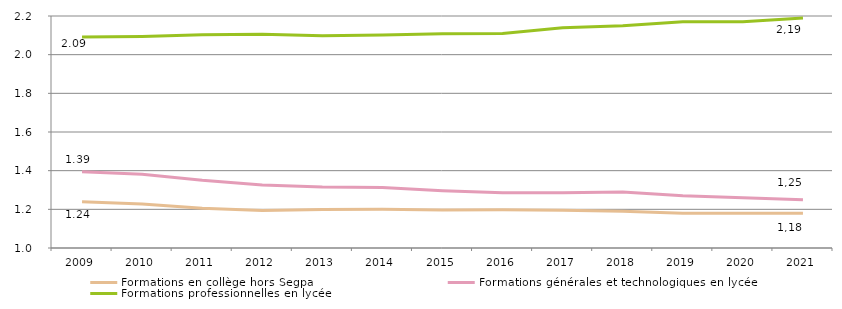
| Category | Formations en collège hors Segpa | Formations générales et technologiques en lycée | Formations professionnelles en lycée |
|---|---|---|---|
| 2009.0 | 1.239 | 1.394 | 2.091 |
| 2010.0 | 1.228 | 1.382 | 2.094 |
| 2011.0 | 1.206 | 1.35 | 2.103 |
| 2012.0 | 1.194 | 1.326 | 2.105 |
| 2013.0 | 1.199 | 1.316 | 2.097 |
| 2014.0 | 1.2 | 1.313 | 2.102 |
| 2015.0 | 1.196 | 1.297 | 2.108 |
| 2016.0 | 1.198 | 1.286 | 2.11 |
| 2017.0 | 1.195 | 1.285 | 2.139 |
| 2018.0 | 1.19 | 1.29 | 2.15 |
| 2019.0 | 1.18 | 1.27 | 2.17 |
| 2020.0 | 1.18 | 1.26 | 2.17 |
| 2021.0 | 1.18 | 1.25 | 2.19 |